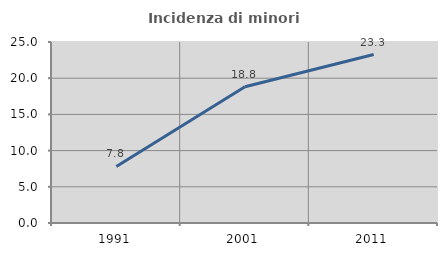
| Category | Incidenza di minori stranieri |
|---|---|
| 1991.0 | 7.81 |
| 2001.0 | 18.819 |
| 2011.0 | 23.265 |